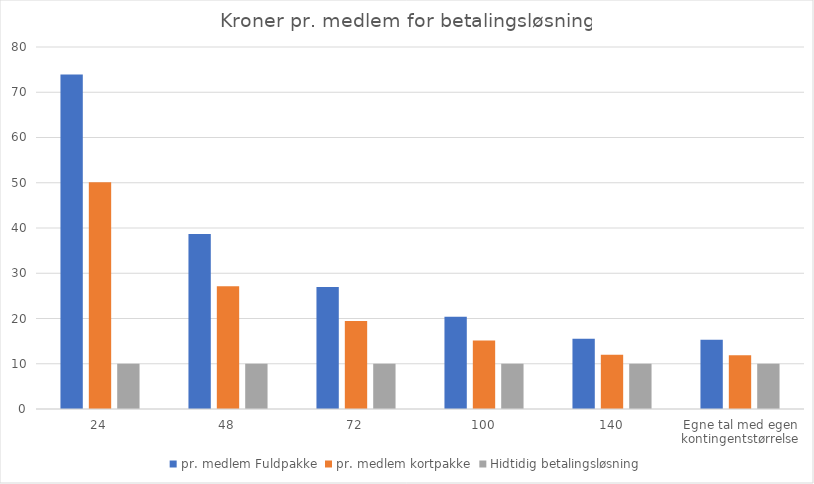
| Category | pr. medlem Fuldpakke | pr. medlem kortpakke | Hidtidig betalingsløsning |
|---|---|---|---|
| 24 | 73.945 | 50.105 | 10 |
| 48 | 38.695 | 27.105 | 10 |
| 72 | 26.945 | 19.438 | 10 |
| 100 | 20.365 | 15.145 | 10 |
| 140 | 15.531 | 11.991 | 10 |
| Egne tal med egen kontingentstørrelse | 15.316 | 11.858 | 10 |